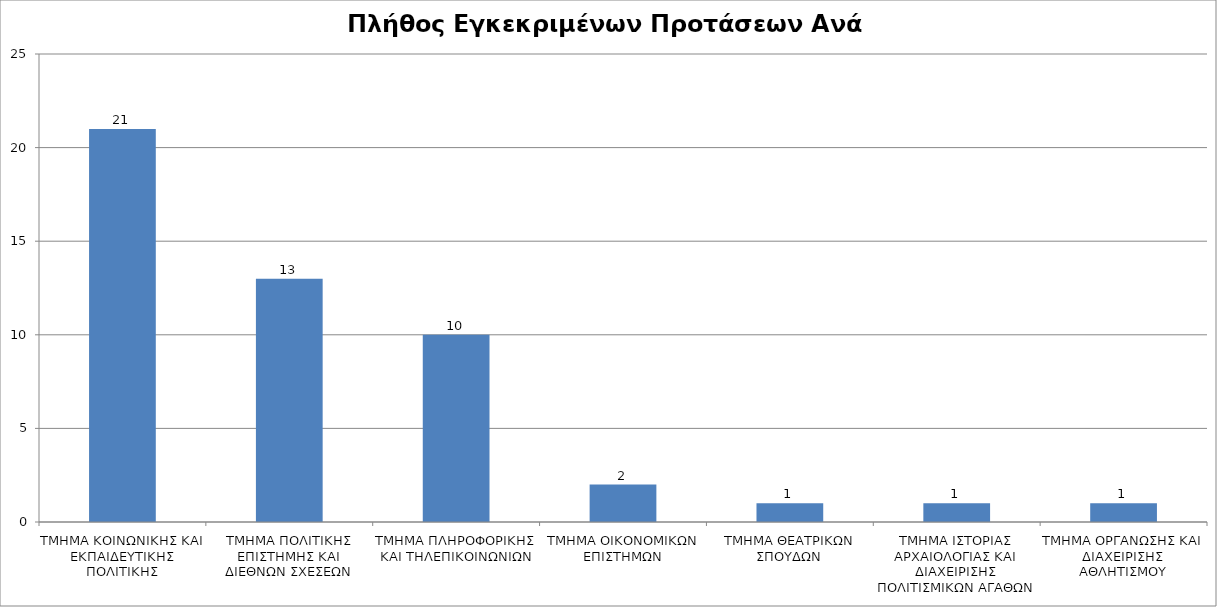
| Category | Series 0 |
|---|---|
| ΤΜΗΜΑ ΚΟΙΝΩΝΙΚΗΣ ΚΑΙ ΕΚΠΑΙΔΕΥΤΙΚΗΣ ΠΟΛΙΤΙΚΗΣ | 21 |
| ΤΜΗΜΑ ΠΟΛΙΤΙΚΗΣ ΕΠΙΣΤΗΜΗΣ ΚΑΙ ΔΙΕΘΝΩΝ ΣΧΕΣΕΩΝ | 13 |
| ΤΜΗΜΑ ΠΛΗΡΟΦΟΡΙΚΗΣ ΚΑΙ ΤΗΛΕΠΙΚΟΙΝΩΝΙΩΝ | 10 |
| ΤΜΗΜΑ ΟΙΚΟΝΟΜΙΚΩΝ ΕΠΙΣΤΗΜΩΝ | 2 |
| ΤΜΗΜΑ ΘΕΑΤΡΙΚΩΝ ΣΠΟΥΔΩΝ | 1 |
| ΤΜΗΜΑ ΙΣΤΟΡΙΑΣ ΑΡΧΑΙΟΛΟΓΙΑΣ ΚΑΙ ΔΙΑΧΕΙΡΙΣΗΣ ΠΟΛΙΤΙΣΜΙΚΩΝ ΑΓΑΘΩΝ | 1 |
| ΤΜΗΜΑ ΟΡΓΑΝΩΣΗΣ ΚΑΙ ΔΙΑΧΕΙΡΙΣΗΣ ΑΘΛΗΤΙΣΜΟΥ | 1 |